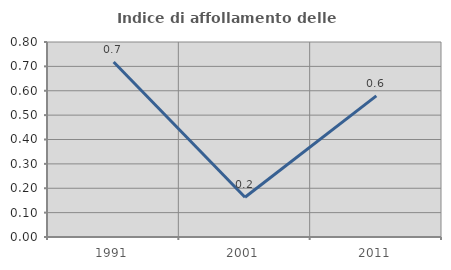
| Category | Indice di affollamento delle abitazioni  |
|---|---|
| 1991.0 | 0.718 |
| 2001.0 | 0.163 |
| 2011.0 | 0.579 |